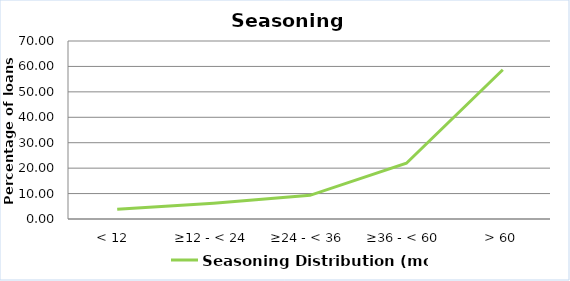
| Category | Seasoning Distribution (months) |
|---|---|
| < 12  | 3.851 |
| ≥12 - < 24 | 6.227 |
| ≥24 - < 36 | 9.297 |
| ≥36 - < 60 | 21.924 |
| > 60 | 58.7 |